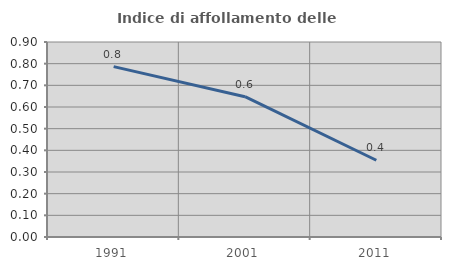
| Category | Indice di affollamento delle abitazioni  |
|---|---|
| 1991.0 | 0.787 |
| 2001.0 | 0.648 |
| 2011.0 | 0.354 |